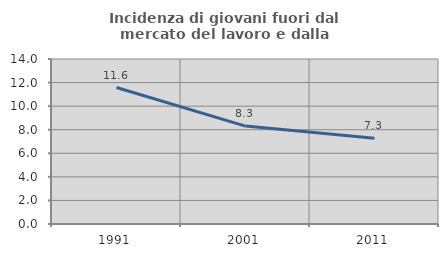
| Category | Incidenza di giovani fuori dal mercato del lavoro e dalla formazione  |
|---|---|
| 1991.0 | 11.581 |
| 2001.0 | 8.308 |
| 2011.0 | 7.266 |